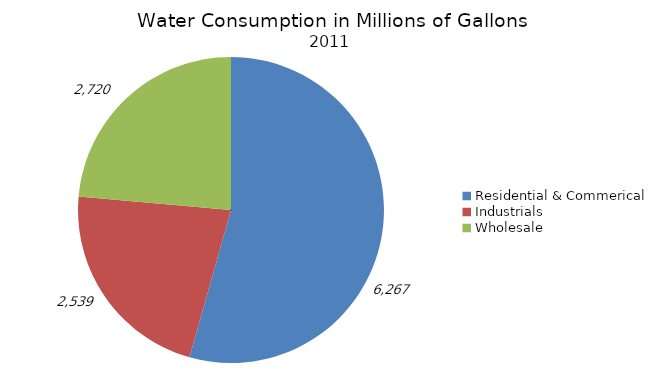
| Category | Series 0 |
|---|---|
| Residential & Commerical | 6267 |
| Industrials | 2539 |
| Wholesale | 2720 |